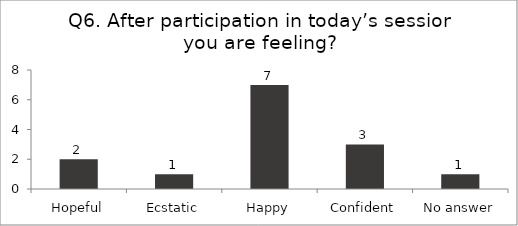
| Category | Q6. After participation in today’s session you are feeling? |
|---|---|
| Hopeful | 2 |
| Ecstatic | 1 |
| Happy | 7 |
| Confident | 3 |
| No answer | 1 |